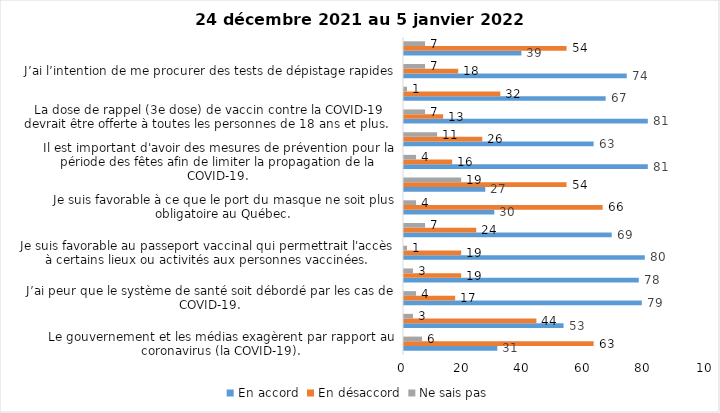
| Category | En accord | En désaccord | Ne sais pas |
|---|---|---|---|
| Le gouvernement et les médias exagèrent par rapport au coronavirus (la COVID-19). | 31 | 63 | 6 |
| Je suis favorable à la mise en place d’un couvre-feu. | 53 | 44 | 3 |
| J’ai peur que le système de santé soit débordé par les cas de COVID-19. | 79 | 17 | 4 |
| Je suis inquiet/inquiète que le nombre de cas augmente en raison des nouveaux variants du virus de la COVID-19. | 78 | 19 | 3 |
| Je suis favorable au passeport vaccinal qui permettrait l'accès à certains lieux ou activités aux personnes vaccinées. | 80 | 19 | 1 |
| Je suis confiant que la vaccination protège efficacement contre les variants de la COVID-19 | 69 | 24 | 7 |
| Je suis favorable à ce que le port du masque ne soit plus obligatoire au Québec. | 30 | 66 | 4 |
| La vaccination des enfants entre 5 et 11 ans mettra fin à la pandémie. | 27 | 54 | 19 |
| Il est important d'avoir des mesures de prévention pour la période des fêtes afin de limiter la propagation de la COVID-19. | 81 | 16 | 4 |
| La pandémie ne sera pas terminée au Québec avant que tous les habitants de la terre puissent être vaccinés contre la COVID-19.   | 63 | 26 | 11 |
| La dose de rappel (3e dose) de vaccin contre la COVID-19 devrait être offerte à toutes les personnes de 18 ans et plus.  | 81 | 13 | 7 |
| Je suis inconfortable d’être en contact avec une personne non vaccinée contre la COVID-19 | 67 | 32 | 1 |
| J’ai l’intention de me procurer des tests de dépistage rapides | 74 | 18 | 7 |
| Je n'ai pas peur du variant Omicron, car il semble moins dangereux pour la santé. | 39 | 54 | 7 |